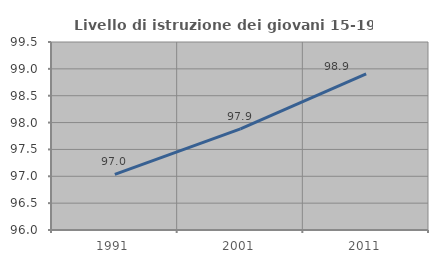
| Category | Livello di istruzione dei giovani 15-19 anni |
|---|---|
| 1991.0 | 97.034 |
| 2001.0 | 97.884 |
| 2011.0 | 98.907 |